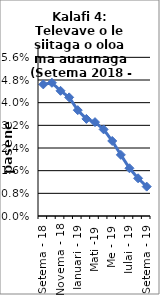
| Category | All items - 12 month rolling year average changes |
|---|---|
| Setema - 18 | 0.046 |
| Oketopa - 18 | 0.047 |
| Novema - 18 | 0.044 |
| Tesema - 18 | 0.042 |
| Ianuari - 19 | 0.037 |
| Fepuari -19 | 0.034 |
| Mati -19 | 0.033 |
| Aperila - 19 | 0.031 |
| Me - 19 | 0.026 |
| Iuni - 19 | 0.022 |
| Iulai - 19 | 0.017 |
| Aukuso - 19 | 0.013 |
| Setema - 19 | 0.01 |